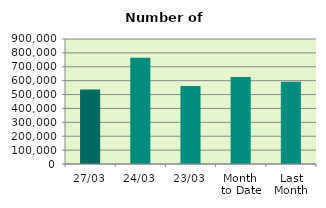
| Category | Series 0 |
|---|---|
| 27/03 | 536418 |
| 24/03 | 764336 |
| 23/03 | 560954 |
| Month 
to Date | 626402.211 |
| Last
Month | 592303 |